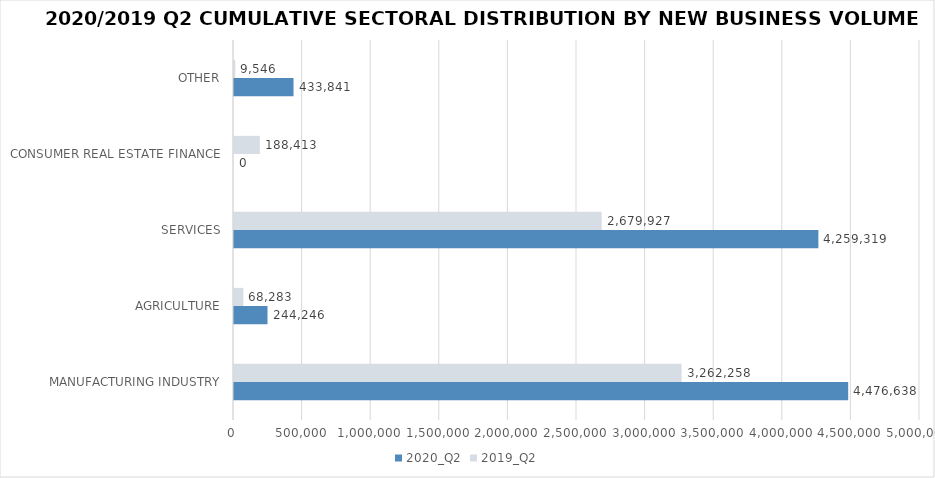
| Category | 2020_Q2 | 2019_Q2 |
|---|---|---|
| MANUFACTURING INDUSTRY | 4476638.024 | 3262257.939 |
| AGRICULTURE | 244245.607 | 68283.285 |
| SERVICES | 4259319.308 | 2679926.714 |
| CONSUMER REAL ESTATE FINANCE | 0 | 188413 |
| OTHER | 433841.38 | 9545.75 |